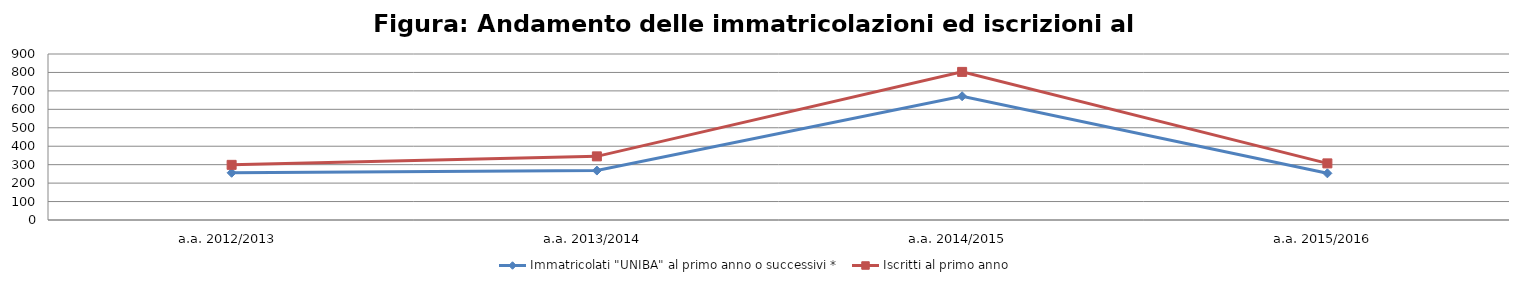
| Category | Immatricolati "UNIBA" al primo anno o successivi * | Iscritti al primo anno  |
|---|---|---|
| a.a. 2012/2013 | 256 | 299 |
| a.a. 2013/2014 | 268 | 345 |
| a.a. 2014/2015 | 671 | 803 |
| a.a. 2015/2016 | 253 | 307 |